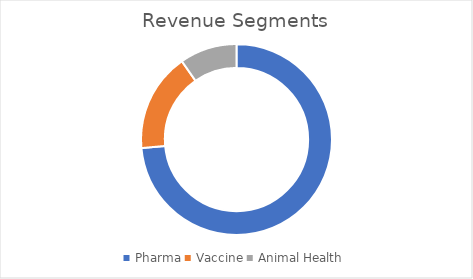
| Category | Series 0 |
|---|---|
| Pharma | 0.736 |
| Vaccine | 0.167 |
| Animal Health | 0.097 |